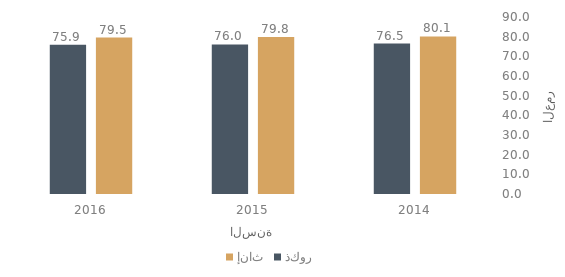
| Category | إناث | ذكور |
|---|---|---|
| 2014.0 | 80.109 | 76.506 |
| 2015.0 | 79.796 | 76.021 |
| 2016.0 | 79.535 | 75.899 |